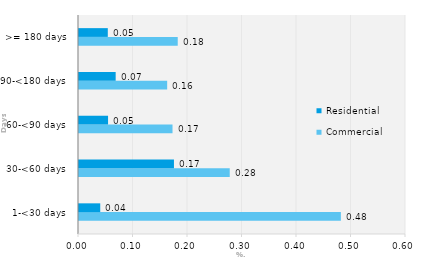
| Category | Commercial | Residential |
|---|---|---|
| 1-<30 days | 0.48 | 0.039 |
| 30-<60 days | 0.277 | 0.174 |
| 60-<90 days | 0.172 | 0.053 |
| 90-<180 days | 0.162 | 0.067 |
| >= 180 days | 0.181 | 0.053 |